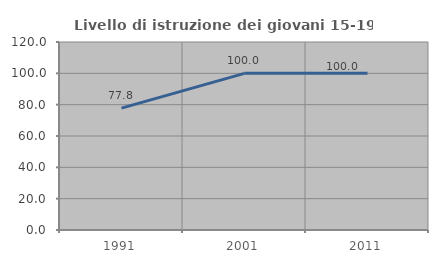
| Category | Livello di istruzione dei giovani 15-19 anni |
|---|---|
| 1991.0 | 77.778 |
| 2001.0 | 100 |
| 2011.0 | 100 |